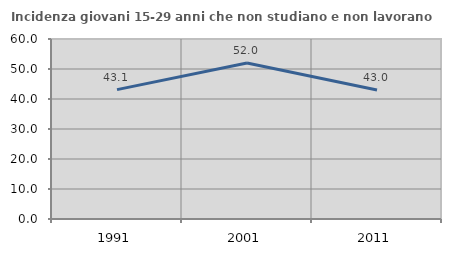
| Category | Incidenza giovani 15-29 anni che non studiano e non lavorano  |
|---|---|
| 1991.0 | 43.119 |
| 2001.0 | 51.974 |
| 2011.0 | 42.975 |